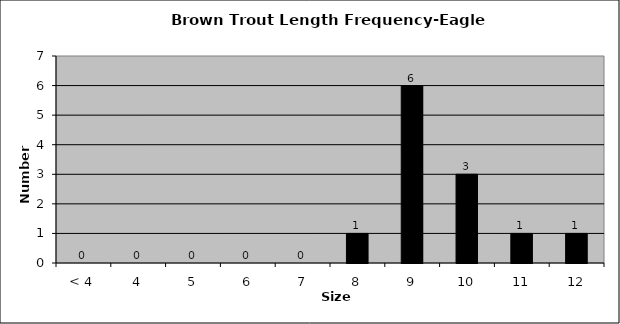
| Category | Series 0 |
|---|---|
| < 4 | 0 |
| 4 | 0 |
| 5 | 0 |
| 6 | 0 |
| 7 | 0 |
| 8 | 1 |
| 9 | 6 |
| 10 | 3 |
| 11 | 1 |
| 12 | 1 |